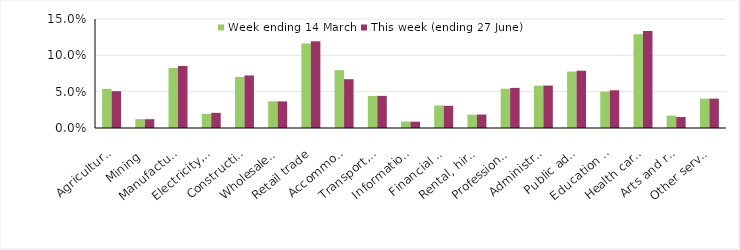
| Category | Week ending 14 March | This week (ending 27 June) |
|---|---|---|
| Agriculture, forestry and fishing | 0.054 | 0.051 |
| Mining | 0.012 | 0.012 |
| Manufacturing | 0.083 | 0.085 |
| Electricity, gas, water and waste services | 0.019 | 0.021 |
| Construction | 0.07 | 0.072 |
| Wholesale trade | 0.037 | 0.037 |
| Retail trade | 0.116 | 0.119 |
| Accommodation and food services | 0.08 | 0.067 |
| Transport, postal and warehousing | 0.044 | 0.044 |
| Information media and telecommunications | 0.009 | 0.009 |
| Financial and insurance services | 0.031 | 0.031 |
| Rental, hiring and real estate services | 0.018 | 0.018 |
| Professional, scientific and technical services | 0.054 | 0.055 |
| Administrative and support services | 0.058 | 0.058 |
| Public administration and safety | 0.078 | 0.079 |
| Education and training | 0.05 | 0.052 |
| Health care and social assistance | 0.129 | 0.134 |
| Arts and recreation services | 0.017 | 0.015 |
| Other services | 0.04 | 0.04 |